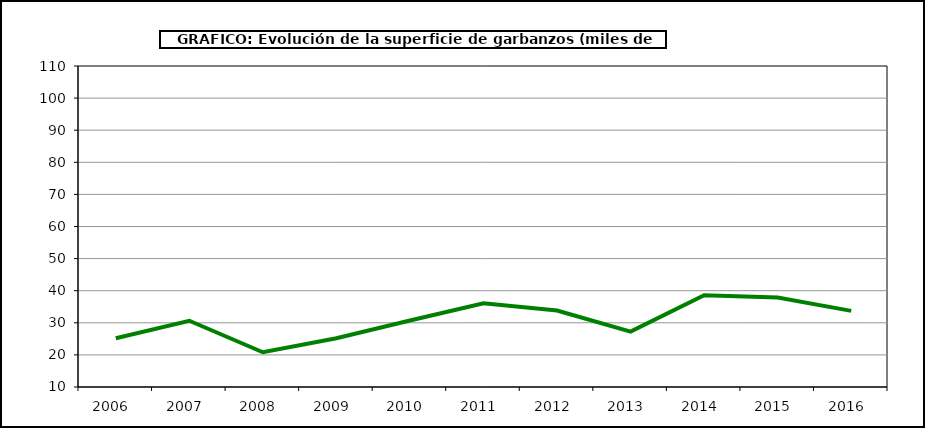
| Category | Superficie |
|---|---|
| 2006.0 | 25.205 |
| 2007.0 | 30.633 |
| 2008.0 | 20.832 |
| 2009.0 | 25.195 |
| 2010.0 | 30.725 |
| 2011.0 | 36.097 |
| 2012.0 | 33.84 |
| 2013.0 | 27.252 |
| 2014.0 | 38.61 |
| 2015.0 | 37.869 |
| 2016.0 | 33.708 |